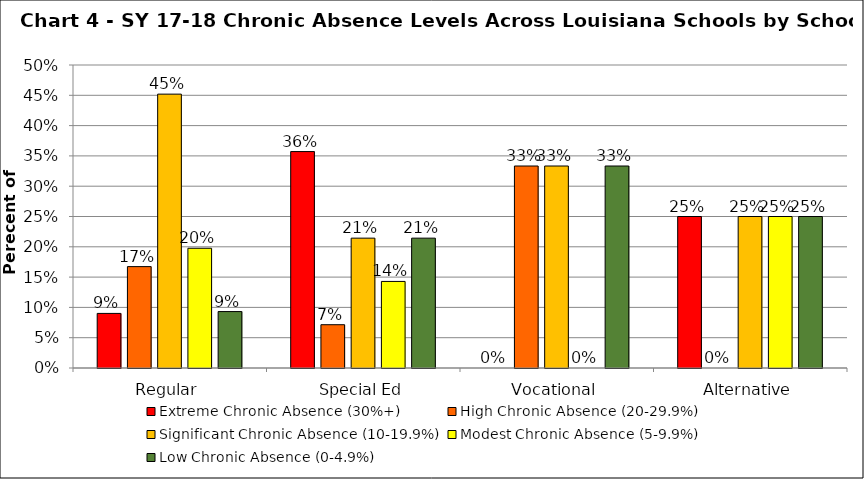
| Category | Extreme Chronic Absence (30%+) | High Chronic Absence (20-29.9%) | Significant Chronic Absence (10-19.9%) | Modest Chronic Absence (5-9.9%) | Low Chronic Absence (0-4.9%) |
|---|---|---|---|---|---|
| 0 | 0.09 | 0.167 | 0.452 | 0.198 | 0.093 |
| 1 | 0.357 | 0.071 | 0.214 | 0.143 | 0.214 |
| 2 | 0 | 0.333 | 0.333 | 0 | 0.333 |
| 3 | 0.25 | 0 | 0.25 | 0.25 | 0.25 |